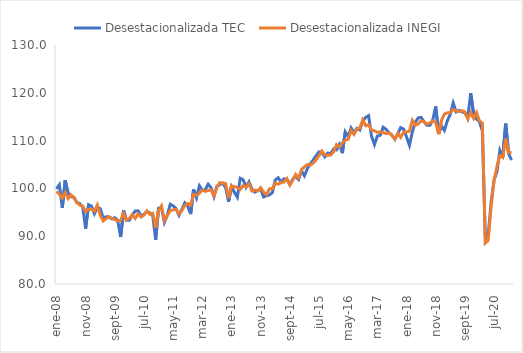
| Category | Desestacionalizada TEC | Desestacionalizada INEGI |
|---|---|---|
| 2008-01-01 | 99.891 | 99.344 |
| 2008-02-01 | 100.771 | 98.815 |
| 2008-03-01 | 95.912 | 97.997 |
| 2008-04-01 | 101.716 | 99.13 |
| 2008-05-01 | 98.978 | 97.872 |
| 2008-06-01 | 98.273 | 98.673 |
| 2008-07-01 | 98.1 | 98.082 |
| 2008-08-01 | 97.048 | 97.005 |
| 2008-09-01 | 96.807 | 96.501 |
| 2008-10-01 | 96.166 | 96.281 |
| 2008-11-01 | 91.59 | 95.153 |
| 2008-12-01 | 96.597 | 95.66 |
| 2009-01-01 | 96.301 | 95.652 |
| 2009-02-01 | 94.702 | 95.223 |
| 2009-03-01 | 96.002 | 96.513 |
| 2009-04-01 | 95.763 | 94.425 |
| 2009-05-01 | 93.826 | 93.177 |
| 2009-06-01 | 94.069 | 93.648 |
| 2009-07-01 | 94.035 | 94.06 |
| 2009-08-01 | 93.614 | 93.769 |
| 2009-09-01 | 93.863 | 93.454 |
| 2009-10-01 | 93.3 | 93.19 |
| 2009-11-01 | 89.831 | 93.321 |
| 2009-12-01 | 95.393 | 94.766 |
| 2010-01-01 | 93.344 | 93.36 |
| 2010-02-01 | 93.346 | 93.736 |
| 2010-03-01 | 94.484 | 94.522 |
| 2010-04-01 | 95.262 | 93.725 |
| 2010-05-01 | 95.302 | 94.7 |
| 2010-06-01 | 94.288 | 94.005 |
| 2010-07-01 | 94.565 | 94.41 |
| 2010-08-01 | 95.174 | 95.273 |
| 2010-09-01 | 94.898 | 94.59 |
| 2010-10-01 | 94.375 | 94.781 |
| 2010-11-01 | 89.26 | 91.728 |
| 2010-12-01 | 95.845 | 95.386 |
| 2011-01-01 | 95.943 | 96.341 |
| 2011-02-01 | 92.913 | 93.297 |
| 2011-03-01 | 94.389 | 94.353 |
| 2011-04-01 | 96.69 | 95.371 |
| 2011-05-01 | 96.353 | 95.504 |
| 2011-06-01 | 95.771 | 95.616 |
| 2011-07-01 | 94.375 | 94.704 |
| 2011-08-01 | 95.625 | 95.388 |
| 2011-09-01 | 96.958 | 96.456 |
| 2011-10-01 | 96.32 | 96.851 |
| 2011-11-01 | 94.624 | 96.492 |
| 2011-12-01 | 99.77 | 98.751 |
| 2012-01-01 | 98.03 | 98.508 |
| 2012-02-01 | 100.557 | 99.003 |
| 2012-03-01 | 99.652 | 99.652 |
| 2012-04-01 | 99.676 | 99.37 |
| 2012-05-01 | 100.884 | 99.575 |
| 2012-06-01 | 100.12 | 99.663 |
| 2012-07-01 | 98.277 | 98.47 |
| 2012-08-01 | 100.469 | 100.238 |
| 2012-09-01 | 100.783 | 101.21 |
| 2012-10-01 | 101.097 | 101.086 |
| 2012-11-01 | 100.139 | 101.013 |
| 2012-12-01 | 97.228 | 97.995 |
| 2013-01-01 | 100.345 | 100.53 |
| 2013-02-01 | 99.161 | 100.375 |
| 2013-03-01 | 98.152 | 100.2 |
| 2013-04-01 | 102.107 | 99.792 |
| 2013-05-01 | 101.805 | 100.571 |
| 2013-06-01 | 100.236 | 100.301 |
| 2013-07-01 | 101.369 | 100.973 |
| 2013-08-01 | 99.865 | 99.449 |
| 2013-09-01 | 99.231 | 99.648 |
| 2013-10-01 | 99.6 | 99.468 |
| 2013-11-01 | 99.837 | 100.155 |
| 2013-12-01 | 98.214 | 99.207 |
| 2014-01-01 | 98.452 | 98.715 |
| 2014-02-01 | 98.64 | 99.907 |
| 2014-03-01 | 99.115 | 99.929 |
| 2014-04-01 | 101.768 | 101.099 |
| 2014-05-01 | 102.238 | 100.898 |
| 2014-06-01 | 101.291 | 101.231 |
| 2014-07-01 | 102.013 | 101.328 |
| 2014-08-01 | 101.878 | 102.054 |
| 2014-09-01 | 100.825 | 100.693 |
| 2014-10-01 | 101.928 | 101.732 |
| 2014-11-01 | 102.518 | 102.918 |
| 2014-12-01 | 101.854 | 102.197 |
| 2015-01-01 | 103.66 | 103.91 |
| 2015-02-01 | 102.635 | 104.518 |
| 2015-03-01 | 104.125 | 104.992 |
| 2015-04-01 | 105.152 | 104.862 |
| 2015-05-01 | 105.918 | 105.271 |
| 2015-06-01 | 106.834 | 105.99 |
| 2015-07-01 | 107.643 | 106.848 |
| 2015-08-01 | 107.482 | 107.819 |
| 2015-09-01 | 106.602 | 107.004 |
| 2015-10-01 | 107.404 | 106.898 |
| 2015-11-01 | 107.262 | 106.993 |
| 2015-12-01 | 108.25 | 107.657 |
| 2016-01-01 | 108.054 | 109.154 |
| 2016-02-01 | 109.186 | 108.68 |
| 2016-03-01 | 107.366 | 109.532 |
| 2016-04-01 | 111.817 | 110.084 |
| 2016-05-01 | 110.884 | 110.275 |
| 2016-06-01 | 112.66 | 112.122 |
| 2016-07-01 | 111.662 | 111.31 |
| 2016-08-01 | 112.578 | 112.407 |
| 2016-09-01 | 112.227 | 112.645 |
| 2016-10-01 | 114.077 | 114.343 |
| 2016-11-01 | 114.864 | 113.092 |
| 2016-12-01 | 115.229 | 113.314 |
| 2017-01-01 | 110.921 | 112.232 |
| 2017-02-01 | 109.171 | 112.068 |
| 2017-03-01 | 110.933 | 111.712 |
| 2017-04-01 | 111.134 | 111.826 |
| 2017-05-01 | 112.791 | 111.687 |
| 2017-06-01 | 112.346 | 111.466 |
| 2017-07-01 | 111.655 | 111.646 |
| 2017-08-01 | 111.13 | 111.103 |
| 2017-09-01 | 110.291 | 110.29 |
| 2017-10-01 | 111.462 | 111.541 |
| 2017-11-01 | 112.72 | 110.681 |
| 2017-12-01 | 112.411 | 111.807 |
| 2018-01-01 | 110.769 | 111.813 |
| 2018-02-01 | 109.019 | 111.972 |
| 2018-03-01 | 111.833 | 114.248 |
| 2018-04-01 | 113.827 | 113.187 |
| 2018-05-01 | 114.744 | 113.467 |
| 2018-06-01 | 114.856 | 114.131 |
| 2018-07-01 | 113.941 | 113.952 |
| 2018-08-01 | 113.205 | 113.441 |
| 2018-09-01 | 113.195 | 113.693 |
| 2018-10-01 | 114.333 | 114.084 |
| 2018-11-01 | 117.133 | 113.844 |
| 2018-12-01 | 111.502 | 111.333 |
| 2019-01-01 | 113.069 | 114.255 |
| 2019-02-01 | 112.152 | 115.537 |
| 2019-03-01 | 114.179 | 115.829 |
| 2019-04-01 | 115.475 | 115.873 |
| 2019-05-01 | 117.874 | 116.538 |
| 2019-06-01 | 115.993 | 116.211 |
| 2019-07-01 | 116.322 | 116.083 |
| 2019-08-01 | 116.014 | 116.247 |
| 2019-09-01 | 115.808 | 116.033 |
| 2019-10-01 | 114.717 | 114.578 |
| 2019-11-01 | 119.93 | 115.874 |
| 2019-12-01 | 115.598 | 114.643 |
| 2020-01-01 | 114.509 | 115.861 |
| 2020-02-01 | 113.999 | 114.121 |
| 2020-03-01 | 111.997 | 113.672 |
| 2020-04-01 | 89.642 | 88.568 |
| 2020-05-01 | 90.32 | 89.137 |
| 2020-06-01 | 97.071 | 96.263 |
| 2020-07-01 | 101.74 | 101.6 |
| 2020-08-01 | 103.504 | 104.602 |
| 2020-09-01 | 107.986 | 106.844 |
| 2020-10-01 | 106.585 | 106.454 |
| 2020-11-01 | 113.546 | 110.395 |
| 2020-12-01 | 107.253 | 107.469 |
| 2021-01-01 | 105.923 | 107.549 |